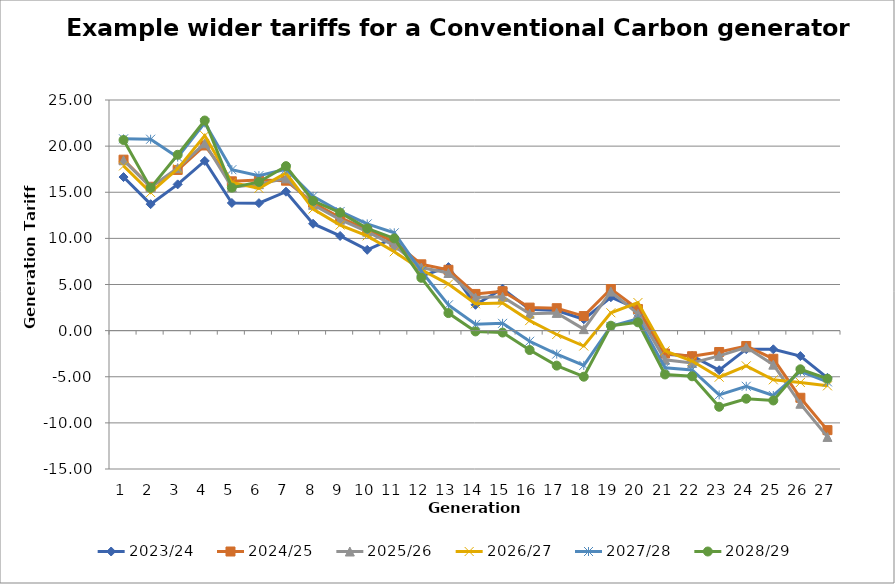
| Category | 2023/24 | 2024/25 | 2025/26 | 2026/27 | 2027/28 | 2028/29 |
|---|---|---|---|---|---|---|
| 0 | 16.647 | 18.533 | 18.466 | 17.854 | 20.788 | 20.663 |
| 1 | 13.708 | 15.596 | 15.555 | 14.97 | 20.747 | 15.475 |
| 2 | 15.854 | 17.417 | 17.62 | 17.539 | 18.807 | 19.06 |
| 3 | 18.396 | 20.072 | 20.308 | 21.139 | 22.52 | 22.776 |
| 4 | 13.84 | 16.187 | 15.541 | 16.053 | 17.444 | 15.501 |
| 5 | 13.818 | 16.315 | 15.872 | 15.425 | 16.801 | 16.12 |
| 6 | 15.06 | 16.253 | 16.505 | 17.087 | 17.495 | 17.831 |
| 7 | 11.587 | 13.865 | 13.642 | 13.184 | 14.56 | 14.07 |
| 8 | 10.261 | 12.246 | 12.022 | 11.445 | 12.915 | 12.79 |
| 9 | 8.759 | 10.943 | 10.725 | 10.274 | 11.57 | 11.08 |
| 10 | 10.043 | 9.62 | 9.223 | 8.551 | 10.602 | 9.997 |
| 11 | 5.916 | 7.188 | 6.842 | 6.603 | 6.435 | 5.723 |
| 12 | 6.888 | 6.595 | 6.249 | 5.038 | 2.794 | 1.903 |
| 13 | 2.801 | 3.977 | 3.582 | 2.91 | 0.683 | -0.086 |
| 14 | 4.542 | 4.269 | 3.659 | 2.987 | 0.788 | -0.211 |
| 15 | 2.317 | 2.496 | 1.83 | 1.084 | -1.154 | -2.104 |
| 16 | 2.18 | 2.433 | 1.922 | -0.419 | -2.546 | -3.794 |
| 17 | 1.228 | 1.578 | 0.16 | -1.669 | -3.769 | -4.995 |
| 18 | 3.62 | 4.506 | 4.232 | 1.936 | 0.462 | 0.534 |
| 19 | 2.321 | 2.337 | 1.814 | 3.046 | 1.294 | 0.899 |
| 20 | -2.577 | -2.485 | -3.155 | -2.197 | -4.02 | -4.751 |
| 21 | -2.749 | -2.775 | -3.508 | -3.3 | -4.257 | -4.95 |
| 22 | -4.286 | -2.317 | -2.737 | -5.052 | -6.969 | -8.256 |
| 23 | -2.011 | -1.664 | -1.809 | -3.818 | -6.035 | -7.38 |
| 24 | -2.026 | -3.054 | -3.687 | -5.331 | -7.032 | -7.572 |
| 25 | -2.759 | -7.28 | -7.925 | -5.62 | -4.422 | -4.191 |
| 26 | -5.118 | -10.787 | -11.523 | -5.986 | -5.557 | -5.214 |